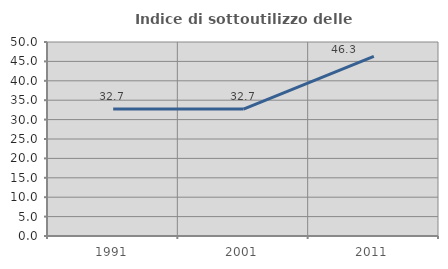
| Category | Indice di sottoutilizzo delle abitazioni  |
|---|---|
| 1991.0 | 32.735 |
| 2001.0 | 32.719 |
| 2011.0 | 46.305 |